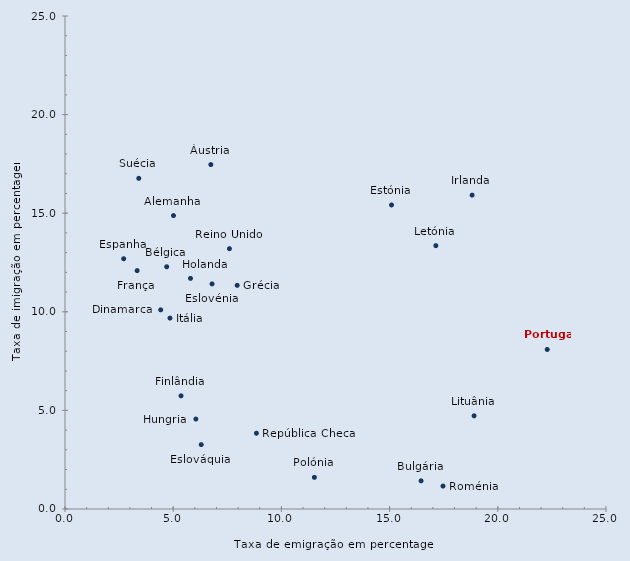
| Category | Series 0 |
|---|---|
| 5.0136125270321825 | 14.879 |
| 6.739097716378535 | 17.466 |
| 4.699362573890239 | 12.284 |
| 16.45349714613876 | 1.428 |
| 4.421792526866347 | 10.099 |
| 6.295682954994031 | 3.265 |
| 6.795077788622732 | 11.413 |
| 2.712397910580007 | 12.69 |
| 15.088247528871104 | 15.416 |
| 5.36166631264676 | 5.74 |
| 3.3325001985780185 | 12.088 |
| 7.956855086763873 | 11.342 |
| 5.798748107008307 | 11.696 |
| 6.047038144913513 | 4.562 |
| 18.812596446811483 | 15.917 |
| 4.851231280943401 | 9.681 |
| 17.136639731073743 | 13.353 |
| 18.903524695100238 | 4.726 |
| 11.524429556419989 | 1.604 |
| 22.28371883020382 | 8.09 |
| 7.598545085041816 | 13.201 |
| 8.845352818398537 | 3.842 |
| 17.467384581384636 | 1.163 |
| 3.4094843603295333 | 16.768 |